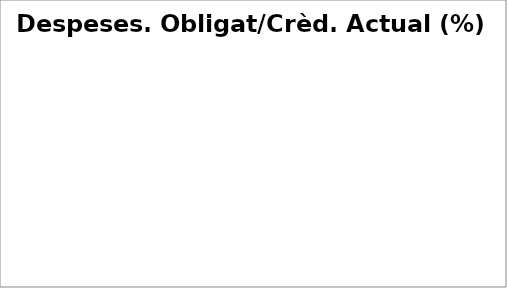
| Category | Series 0 |
|---|---|
| Despeses de personal | 0.317 |
| Despeses en béns corrents i serveis | 0.149 |
| Despeses financeres | 0.221 |
| Transferències corrents | 0.271 |
| Fons de contingència | 0 |
| Inversions reals | 0.133 |
| Transferències de capital | 0.003 |
| Actius financers | 0.39 |
| Passius financers | 0.282 |